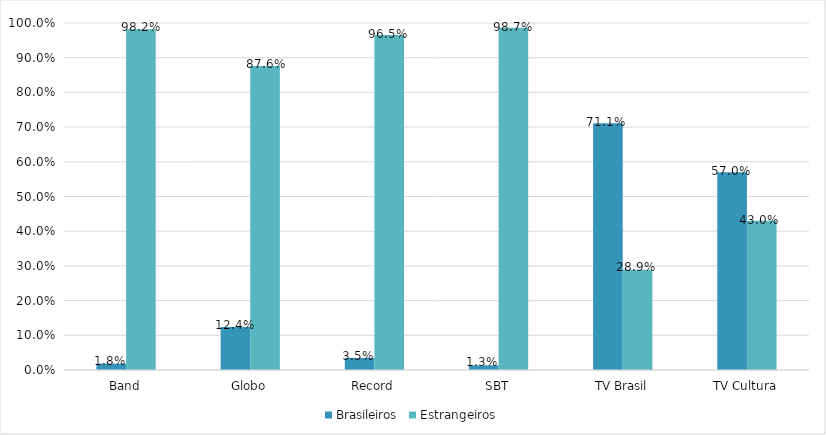
| Category | Brasileiros | Estrangeiros |
|---|---|---|
| Band | 0.018 | 0.982 |
| Globo | 0.124 | 0.876 |
| Record | 0.035 | 0.965 |
| SBT | 0.013 | 0.987 |
| TV Brasil | 0.711 | 0.289 |
| TV Cultura | 0.57 | 0.43 |